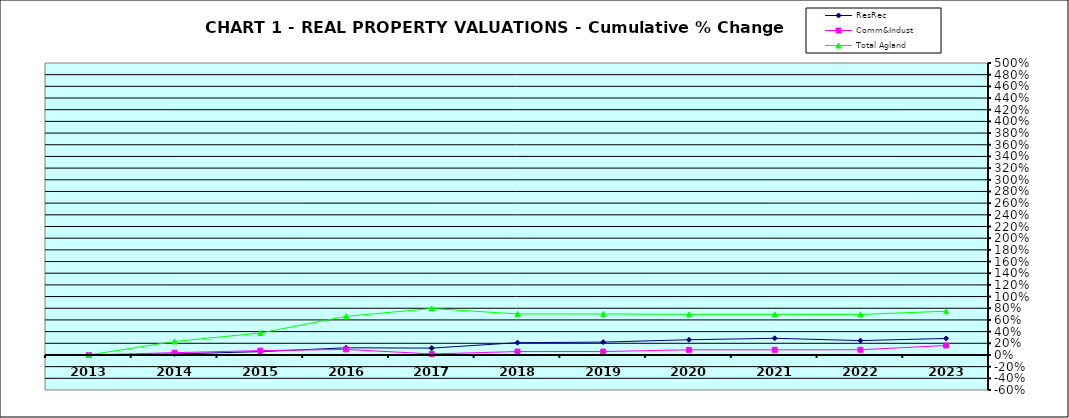
| Category | ResRec | Comm&Indust | Total Agland |
|---|---|---|---|
| 2013.0 | 0 | 0 | 0 |
| 2014.0 | 0.017 | 0.039 | 0.231 |
| 2015.0 | 0.057 | 0.074 | 0.376 |
| 2016.0 | 0.123 | 0.095 | 0.661 |
| 2017.0 | 0.117 | 0.018 | 0.796 |
| 2018.0 | 0.21 | 0.058 | 0.703 |
| 2019.0 | 0.22 | 0.059 | 0.702 |
| 2020.0 | 0.261 | 0.088 | 0.695 |
| 2021.0 | 0.285 | 0.088 | 0.696 |
| 2022.0 | 0.246 | 0.089 | 0.694 |
| 2023.0 | 0.283 | 0.162 | 0.749 |